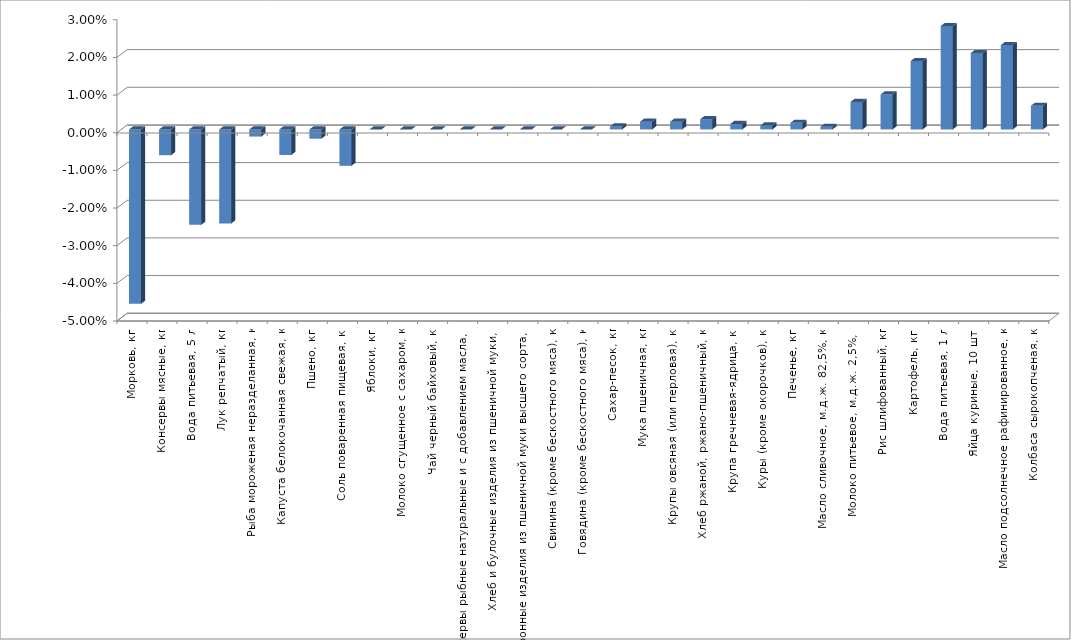
| Category | Series 0 |
|---|---|
| Морковь, кг | -0.046 |
| Консервы мясные, кг | -0.007 |
| Вода питьевая, 5 л | -0.025 |
| Лук репчатый, кг | -0.025 |
| Рыба мороженая неразделанная, кг | -0.002 |
| Капуста белокочанная свежая, кг | -0.007 |
| Пшено, кг | -0.002 |
| Соль поваренная пищевая, кг | -0.01 |
| Яблоки, кг | 0 |
| Молоко сгущенное с сахаром, кг | 0 |
| Чай черный байховый, кг | 0 |
| Консервы рыбные натуральные и с добавлением масла, кг | 0 |
| Хлеб и булочные изделия из пшеничной муки, кг | 0 |
| Макаронные изделия из пшеничной муки высшего сорта, кг | 0 |
| Свинина (кроме бескостного мяса), кг | 0 |
| Говядина (кроме бескостного мяса), кг | 0 |
| Сахар-песок, кг | 0.001 |
| Мука пшеничная, кг | 0.002 |
| Крупы овсяная (или перловая), кг | 0.002 |
| Хлеб ржаной, ржано-пшеничный, кг | 0.003 |
| Крупа гречневая-ядрица, кг | 0.001 |
| Куры (кроме окорочков), кг | 0.001 |
| Печенье, кг | 0.002 |
| Масло сливочное, м.д.ж. 82,5%, кг | 0.001 |
| Молоко питьевое, м.д.ж. 2,5%, л | 0.007 |
| Рис шлифованный, кг | 0.009 |
| Картофель, кг | 0.018 |
| Вода питьевая, 1 л | 0.027 |
| Яйца куриные, 10 шт. | 0.02 |
| Масло подсолнечное рафинированное, кг | 0.022 |
| Колбаса сырокопченая, кг | 0.006 |